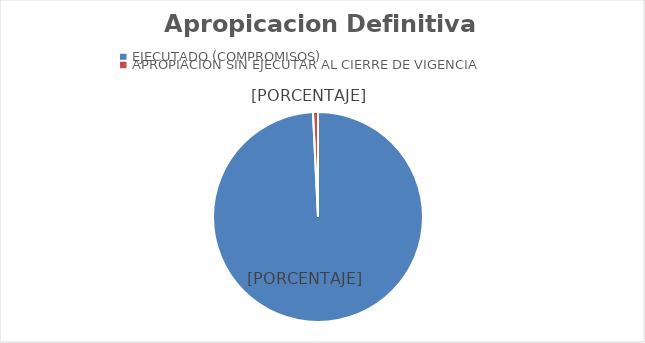
| Category | Series 0 |
|---|---|
| EJECUTADO (COMPROMISOS) | 487473182505.22 |
| APROPIACION SIN EJECUTAR AL CIERRE DE VIGENCIA | 3768856772.78 |